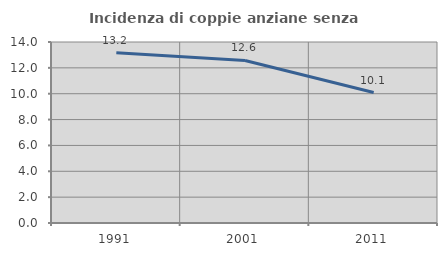
| Category | Incidenza di coppie anziane senza figli  |
|---|---|
| 1991.0 | 13.176 |
| 2001.0 | 12.575 |
| 2011.0 | 10.09 |